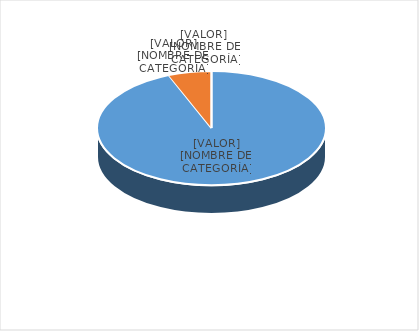
| Category | Series 0 |
|---|---|
| PRESUPUESTO VIGENTE PARA 2023 | 31000000 |
| PRESUPUESTO EJECUTADO  | 2011619.55 |
| PORCENTAJE DE EJECUCIÓN  | 0.065 |